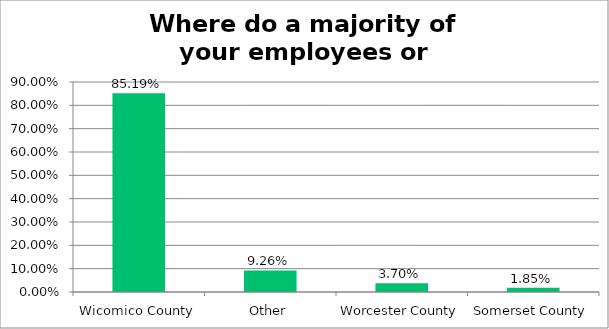
| Category | Responses |
|---|---|
| Wicomico County | 0.852 |
| Other | 0.093 |
| Worcester County | 0.037 |
| Somerset County | 0.018 |